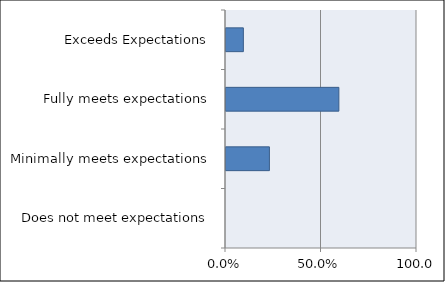
| Category | Series 0 |
|---|---|
| Does not meet expectations | 0 |
| Minimally meets expectations | 0.227 |
| Fully meets expectations | 0.591 |
| Exceeds Expectations | 0.091 |